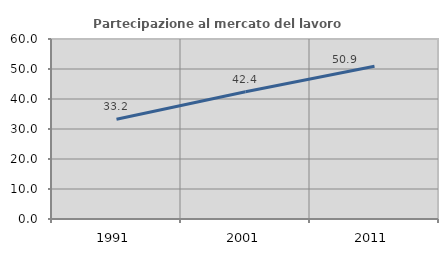
| Category | Partecipazione al mercato del lavoro  femminile |
|---|---|
| 1991.0 | 33.24 |
| 2001.0 | 42.439 |
| 2011.0 | 50.915 |